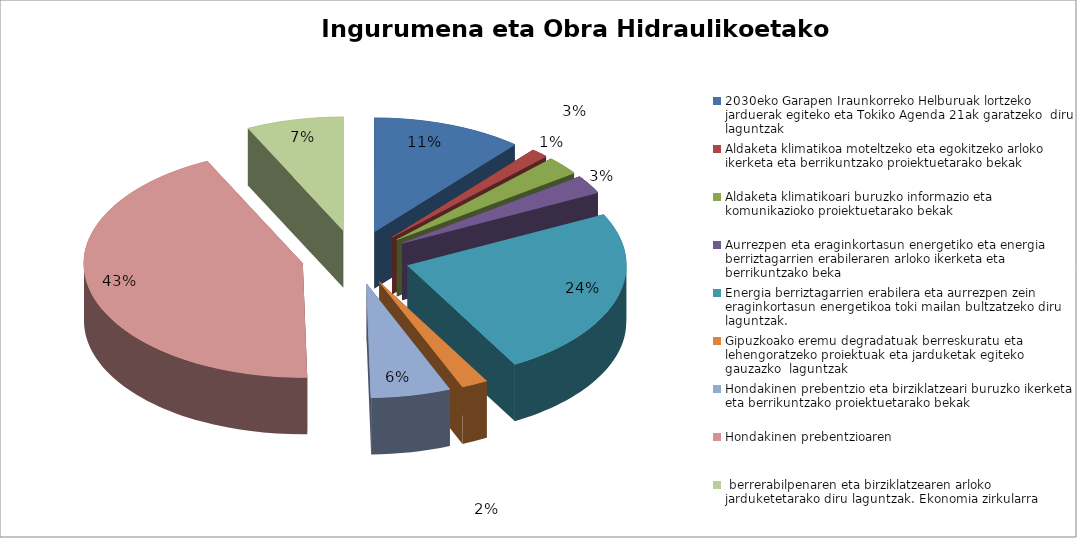
| Category |  Eskaerak | Ezetsiak | Emakida |
|---|---|---|---|
| 2030eko Garapen Iraunkorreko Helburuak lortzeko jarduerak egiteko eta Tokiko Agenda 21ak garatzeko  diru laguntzak | 17 | 6 | 98967.86 |
| Aldaketa klimatikoa moteltzeko eta egokitzeko arloko ikerketa eta berrikuntzako proiektuetarako bekak | 2 | 2 | 0 |
| Aldaketa klimatikoari buruzko informazio eta komunikazioko proiektuetarako bekak | 4 | 2 | 24000 |
| Aurrezpen eta eraginkortasun energetiko eta energia berriztagarrien erabileraren arloko ikerketa eta berrikuntzako beka | 4 | 2 | 24000 |
| Energia berriztagarrien erabilera eta aurrezpen zein eraginkortasun energetikoa toki mailan bultzatzeko diru laguntzak. | 37 | 10 | 246294.25 |
| Gipuzkoako eremu degradatuak berreskuratu eta lehengoratzeko proiektuak eta jarduketak egiteko gauzazko  laguntzak | 3 | 3 | 0 |
| Hondakinen prebentzio eta birziklatzeari buruzko ikerketa eta berrikuntzako proiektuetarako bekak | 9 | 2 | 84000 |
| Hondakinen prebentzioaren, berrerabilpenaren eta birziklatzearen arloko jarduketetarako diru laguntzak. Ekonomia zirkularra | 66 | 28 | 649430.41 |
| Irabazi-asmorik gabeko elkarteei ingurumen-dibulgazioko jardunaldietarako diru-laguntzak | 11 | 5 | 20000 |